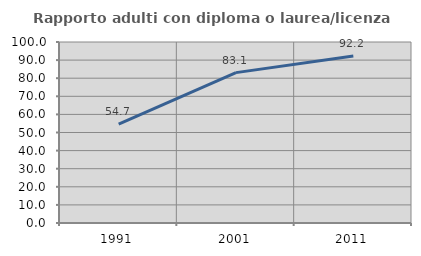
| Category | Rapporto adulti con diploma o laurea/licenza media  |
|---|---|
| 1991.0 | 54.667 |
| 2001.0 | 83.082 |
| 2011.0 | 92.216 |